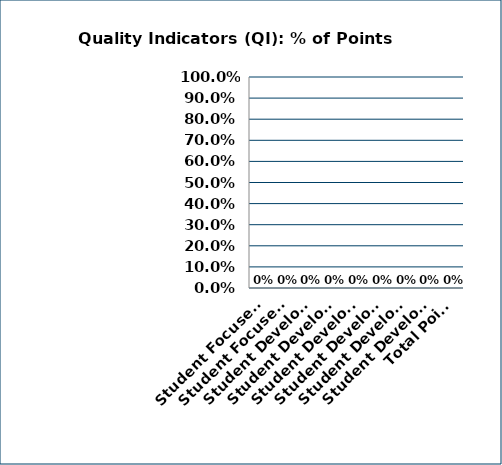
| Category | Series 0 |
|---|---|
| Student Focused Plannning: Transition Assessment | 0 |
| Student Focused Plannning: Self-Determination/Self-Advocacy | 0 |
| Student Development: Academics | 0 |
| Student Development: Communication | 0 |
| Student Development: Home Living and Consumer Skills | 0 |
| Student Development: Community Inclusion | 0 |
| Student Development: Workplace Skills | 0 |
| Student Development: Interagency Collaboration | 0 |
| Total Points | 0 |